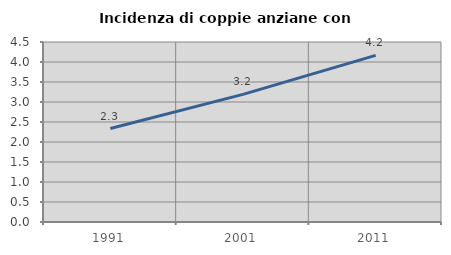
| Category | Incidenza di coppie anziane con figli |
|---|---|
| 1991.0 | 2.336 |
| 2001.0 | 3.191 |
| 2011.0 | 4.167 |